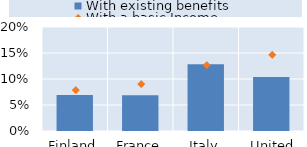
| Category | With existing benefits |
|---|---|
| Finland | 0.069 |
| France | 0.069 |
| Italy | 0.128 |
| United Kingdom | 0.104 |